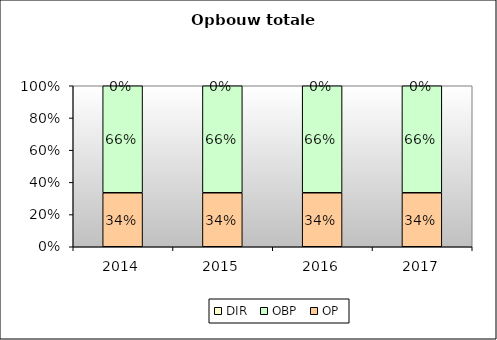
| Category | OP | OBP | DIR |
|---|---|---|---|
| 2014.0 | 0.335 | 0.665 | 0 |
| 2015.0 | 0.335 | 0.665 | 0 |
| 2016.0 | 0.335 | 0.665 | 0 |
| 2017.0 | 0.335 | 0.665 | 0 |